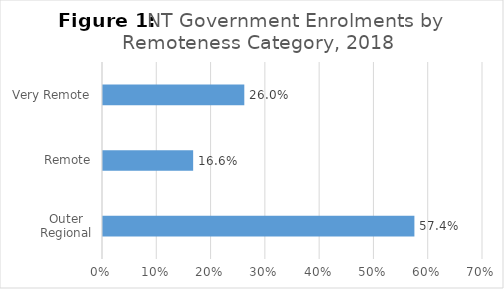
| Category | Series 0 |
|---|---|
| Outer Regional | 0.574 |
| Remote | 0.166 |
| Very Remote | 0.26 |